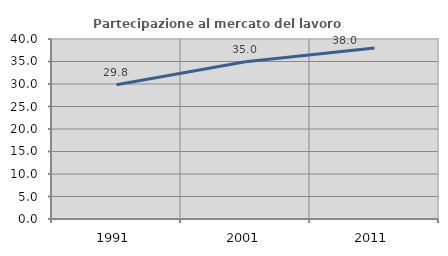
| Category | Partecipazione al mercato del lavoro  femminile |
|---|---|
| 1991.0 | 29.848 |
| 2001.0 | 34.954 |
| 2011.0 | 38.023 |